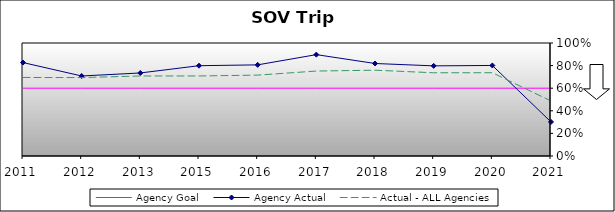
| Category | Agency Goal | Agency Actual | Actual - ALL Agencies |
|---|---|---|---|
| 2011.0 | 0.6 | 0.827 | 0.695 |
| 2012.0 | 0.6 | 0.708 | 0.694 |
| 2013.0 | 0.6 | 0.735 | 0.708 |
| 2015.0 | 0.6 | 0.799 | 0.708 |
| 2016.0 | 0.6 | 0.806 | 0.716 |
| 2017.0 | 0.6 | 0.897 | 0.752 |
| 2018.0 | 0.6 | 0.819 | 0.759 |
| 2019.0 | 0.6 | 0.798 | 0.736 |
| 2020.0 | 0.6 | 0.801 | 0.737 |
| 2021.0 | 0.6 | 0.301 | 0.487 |